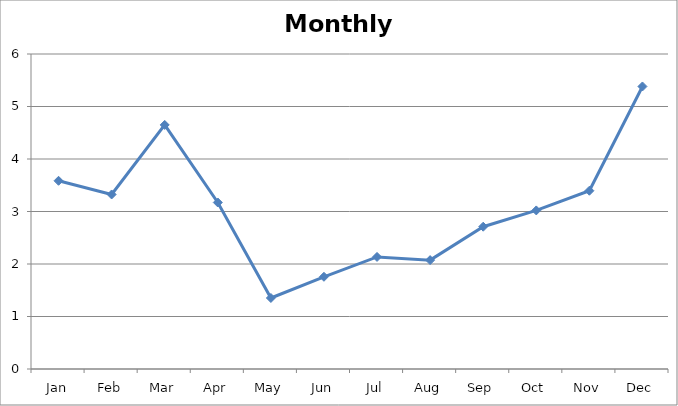
| Category | Monthly Average |
|---|---|
| Jan | 3.585 |
| Feb | 3.324 |
| Mar | 4.649 |
| Apr | 3.172 |
| May | 1.352 |
| Jun | 1.757 |
| Jul | 2.135 |
| Aug | 2.074 |
| Sep | 2.71 |
| Oct | 3.02 |
| Nov | 3.396 |
| Dec | 5.382 |